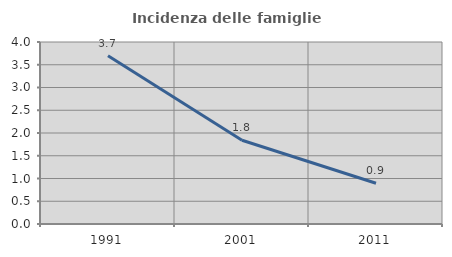
| Category | Incidenza delle famiglie numerose |
|---|---|
| 1991.0 | 3.696 |
| 2001.0 | 1.84 |
| 2011.0 | 0.896 |